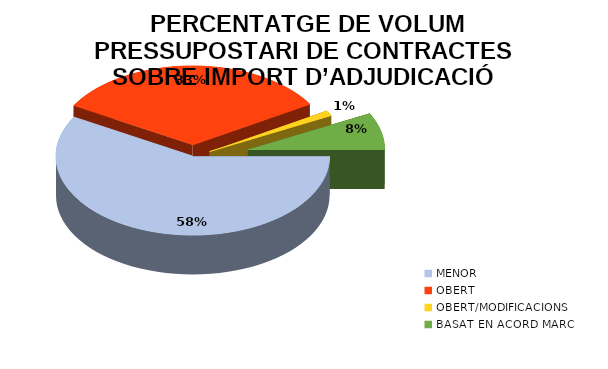
| Category |  PERCENTATGE DE VOLUM PRESSUPOSTARI DE CONTRACTES MITJANÇANT ELS PROCEDIMENTS D’ADJUDICACIÓ |
|---|---|
| MENOR | 0.582 |
| OBERT | 0.331 |
| OBERT/MODIFICACIONS | 0.011 |
| BASAT EN ACORD MARC | 0.076 |